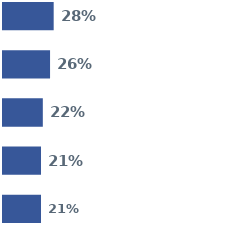
| Category | Series 0 | Series 1 | Series 2 | Series 3 | Series 4 |
|---|---|---|---|---|---|
| 0 | 0.28 | 0.26 | 0.22 | 0.21 | 0.21 |